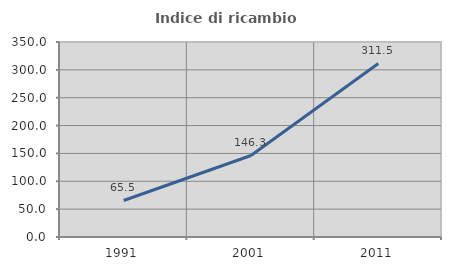
| Category | Indice di ricambio occupazionale  |
|---|---|
| 1991.0 | 65.517 |
| 2001.0 | 146.341 |
| 2011.0 | 311.538 |